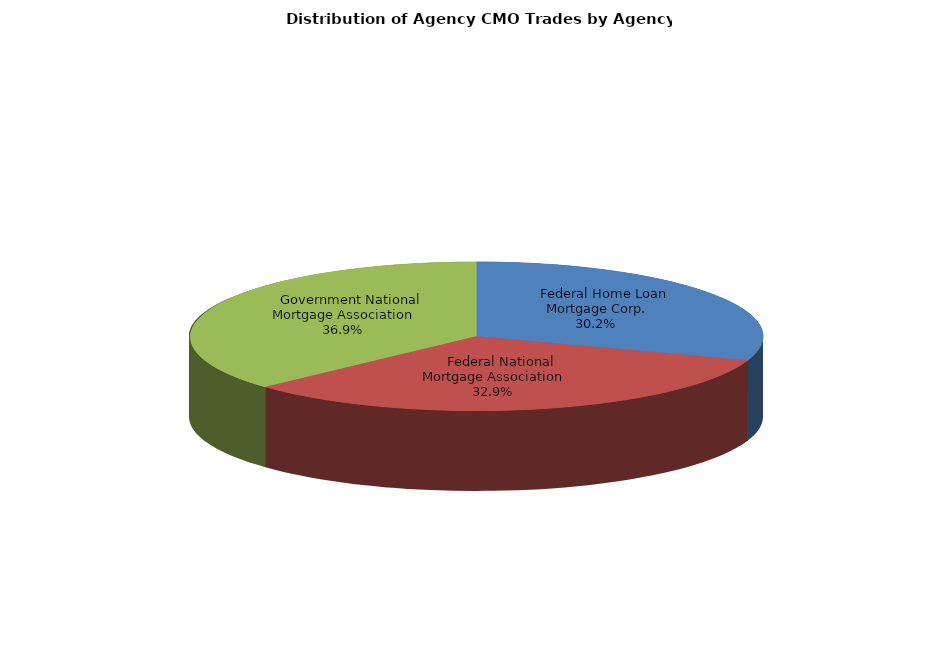
| Category | Series 0 |
|---|---|
|     Federal Home Loan Mortgage Corp. | 498.083 |
|     Federal National Mortgage Association | 541.488 |
|     Government National Mortgage Association | 607.798 |